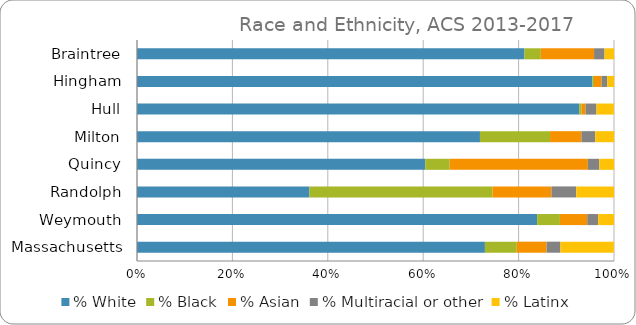
| Category | % White | % Black | % Asian | % Multiracial or other | % Latinx |
|---|---|---|---|---|---|
| Braintree | 81.23 | 3.43 | 11.16 | 2.2 | 2 |
| Hingham | 95.48 | 0.33 | 1.58 | 1.2 | 1.44 |
| Hull | 92.71 | 0.45 | 0.87 | 2.3 | 3.65 |
| Milton | 71.9 | 14.69 | 6.58 | 2.9 | 3.97 |
| Quincy | 60.43 | 5.12 | 28.97 | 2.4 | 3.1 |
| Randolph | 36.16 | 38.36 | 12.37 | 5.2 | 7.92 |
| Weymouth | 83.89 | 4.77 | 5.73 | 2.3 | 3.31 |
| Massachusetts | 72.94 | 6.68 | 6.25 | 2.9 | 11.2 |